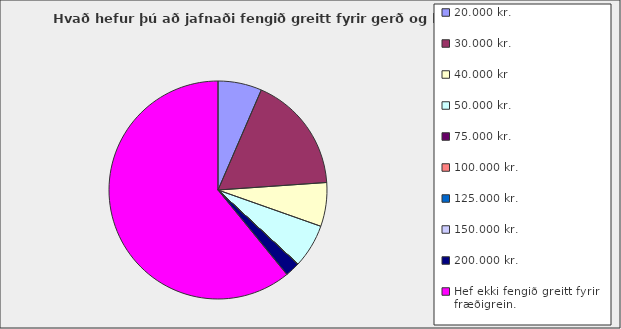
| Category | Series 0 |
|---|---|
| 20.000 kr. | 0.065 |
| 30.000 kr. | 0.174 |
| 40.000 kr | 0.065 |
| 50.000 kr. | 0.065 |
| 75.000 kr. | 0 |
| 100.000 kr. | 0 |
| 125.000 kr. | 0 |
| 150.000 kr. | 0 |
| 200.000 kr. | 0.022 |
| Hef ekki fengið greitt fyrir fræðigrein. | 0.609 |